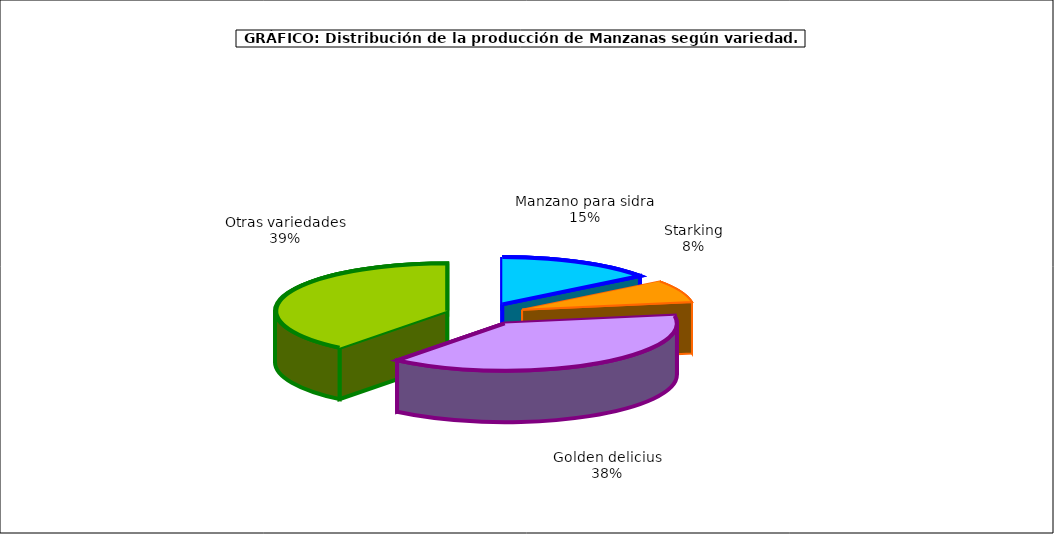
| Category | produccion |
|---|---|
| 0 | 77.069 |
| 1 | 39.929 |
| 2 | 200.478 |
| 3 | 205.142 |